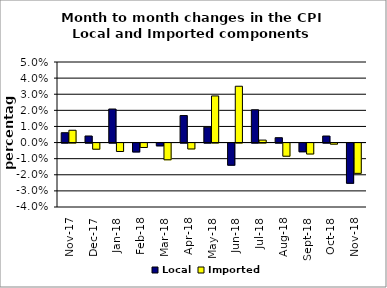
| Category | Local | Imported |
|---|---|---|
| 2017-11-01 | 0.006 | 0.008 |
| 2017-12-01 | 0.004 | -0.004 |
| 2018-01-01 | 0.021 | -0.005 |
| 2018-02-01 | -0.006 | -0.003 |
| 2018-03-01 | -0.002 | -0.01 |
| 2018-04-01 | 0.017 | -0.004 |
| 2018-05-01 | 0.01 | 0.029 |
| 2018-06-01 | -0.014 | 0.035 |
| 2018-07-01 | 0.02 | 0.002 |
| 2018-08-01 | 0.003 | -0.008 |
| 2018-09-01 | -0.005 | -0.007 |
| 2018-10-01 | 0.004 | -0.001 |
| 2018-11-01 | -0.025 | -0.019 |